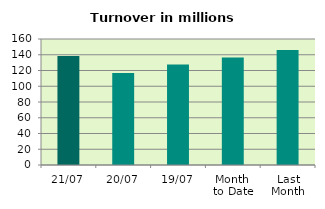
| Category | Series 0 |
|---|---|
| 21/07 | 138.271 |
| 20/07 | 116.946 |
| 19/07 | 127.523 |
| Month 
to Date | 136.666 |
| Last
Month | 145.879 |